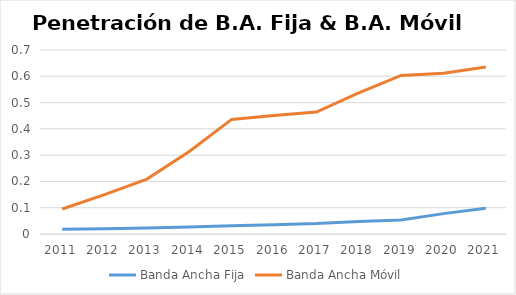
| Category | Banda Ancha Fija  | Banda Ancha Móvil |
|---|---|---|
| 2011.0 | 0.018 | 0.095 |
| 2012.0 | 0.02 | 0.15 |
| 2013.0 | 0.023 | 0.209 |
| 2014.0 | 0.027 | 0.314 |
| 2015.0 | 0.031 | 0.436 |
| 2016.0 | 0.036 | 0.451 |
| 2017.0 | 0.04 | 0.464 |
| 2018.0 | 0.048 | 0.537 |
| 2019.0 | 0.053 | 0.603 |
| 2020.0 | 0.078 | 0.612 |
| 2021.0 | 0.098 | 0.635 |